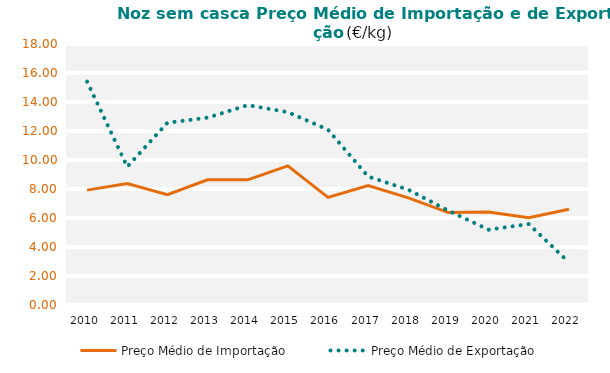
| Category | Preço Médio de Importação | Preço Médio de Exportação |
|---|---|---|
| 2010.0 | 7.922 | 15.405 |
| 2011.0 | 8.378 | 9.536 |
| 2012.0 | 7.605 | 12.565 |
| 2013.0 | 8.636 | 12.917 |
| 2014.0 | 8.631 | 13.782 |
| 2015.0 | 9.595 | 13.299 |
| 2016.0 | 7.416 | 12.091 |
| 2017.0 | 8.234 | 8.858 |
| 2018.0 | 7.385 | 7.951 |
| 2019.0 | 6.376 | 6.5 |
| 2020.0 | 6.416 | 5.192 |
| 2021.0 | 6.012 | 5.581 |
| 2022.0 | 6.598 | 2.942 |